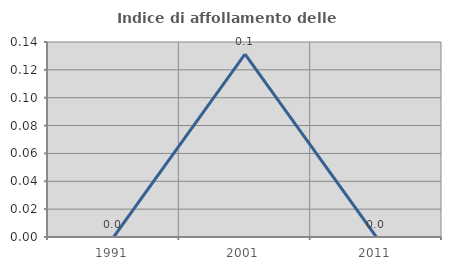
| Category | Indice di affollamento delle abitazioni  |
|---|---|
| 1991.0 | 0 |
| 2001.0 | 0.131 |
| 2011.0 | 0 |